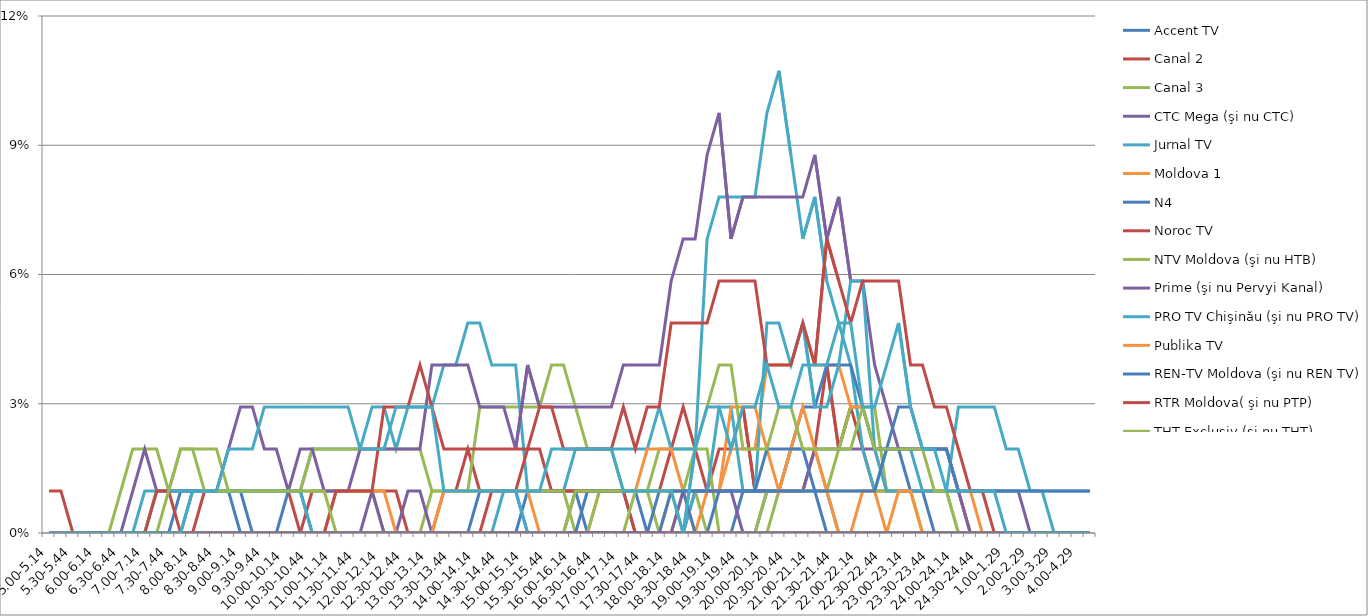
| Category | Accent TV | Canal 2 | Canal 3 | CTC Mega (şi nu CTC) | Jurnal TV | Moldova 1 | N4 | Noroc TV | NTV Moldova (şi nu HTB) | Prime (şi nu Pervyi Kanal) | PRO TV Chişinău (şi nu PRO TV) | Publika TV  | REN-TV Moldova (şi nu REN TV)  | RTR Moldova( şi nu PTP)  | THT Exclusiv (şi nu THT) | TV8 | TVC 21 | TVR MOLDOVA (şi nu TVR) | Canal Regional | Familia Domashniy | ITV | Moldova 2 | Alt canal |
|---|---|---|---|---|---|---|---|---|---|---|---|---|---|---|---|---|---|---|---|---|---|---|---|
| 5.00-5.14 | 0 | 0 | 0 | 0 | 0 | 0 | 0 | 0 | 0 | 0 | 0 | 0 | 0 | 0.01 | 0 | 0 | 0 | 0 | 0 | 0 | 0 | 0 | 0 |
| 5.15-5.29 | 0 | 0 | 0 | 0 | 0 | 0 | 0 | 0 | 0 | 0 | 0 | 0 | 0 | 0.01 | 0 | 0 | 0 | 0 | 0 | 0 | 0 | 0 | 0 |
| 5.30-5.44 | 0 | 0 | 0 | 0 | 0 | 0 | 0 | 0 | 0 | 0 | 0 | 0 | 0 | 0 | 0 | 0 | 0 | 0 | 0 | 0 | 0 | 0 | 0 |
| 5.45-5.59 | 0 | 0 | 0 | 0 | 0 | 0 | 0 | 0 | 0 | 0 | 0 | 0 | 0 | 0 | 0 | 0 | 0 | 0 | 0 | 0 | 0 | 0 | 0 |
| 6.00-6.14 | 0 | 0 | 0 | 0 | 0 | 0 | 0 | 0 | 0 | 0 | 0 | 0 | 0 | 0 | 0 | 0 | 0 | 0 | 0 | 0 | 0 | 0 | 0 |
| 6.15-6.29 | 0 | 0 | 0 | 0 | 0 | 0 | 0 | 0 | 0 | 0 | 0 | 0 | 0 | 0 | 0 | 0 | 0 | 0 | 0 | 0 | 0 | 0 | 0 |
| 6.30-6.44 | 0 | 0 | 0.01 | 0 | 0 | 0 | 0 | 0 | 0 | 0 | 0 | 0 | 0 | 0 | 0 | 0 | 0 | 0 | 0 | 0 | 0 | 0 | 0 |
| 6.45-6.59 | 0 | 0 | 0.02 | 0 | 0 | 0 | 0 | 0 | 0 | 0.01 | 0 | 0 | 0 | 0 | 0 | 0 | 0 | 0 | 0 | 0 | 0 | 0 | 0 |
| 7.00-7.14 | 0 | 0 | 0.02 | 0 | 0 | 0 | 0 | 0 | 0 | 0.02 | 0.01 | 0 | 0 | 0 | 0 | 0 | 0 | 0 | 0 | 0 | 0 | 0 | 0 |
| 7.15-7.29 | 0 | 0 | 0.02 | 0 | 0.01 | 0 | 0 | 0 | 0.01 | 0.01 | 0.01 | 0 | 0 | 0.01 | 0 | 0 | 0 | 0 | 0 | 0 | 0 | 0 | 0 |
| 7.30-7.44 | 0 | 0 | 0.01 | 0 | 0.01 | 0 | 0 | 0 | 0.01 | 0.01 | 0.01 | 0 | 0 | 0.01 | 0.01 | 0 | 0 | 0 | 0 | 0 | 0 | 0 | 0 |
| 7.45-7.59 | 0 | 0 | 0.01 | 0 | 0.01 | 0 | 0.01 | 0 | 0.02 | 0.01 | 0.01 | 0 | 0 | 0 | 0.02 | 0 | 0 | 0 | 0 | 0 | 0 | 0 | 0 |
| 8.00-8.14 | 0.01 | 0 | 0.01 | 0 | 0.01 | 0 | 0.01 | 0 | 0.02 | 0.01 | 0.01 | 0 | 0 | 0 | 0.02 | 0 | 0 | 0 | 0 | 0 | 0 | 0 | 0.01 |
| 8.15-8.29 | 0.01 | 0.01 | 0.01 | 0 | 0.01 | 0 | 0.01 | 0 | 0.02 | 0.01 | 0.01 | 0 | 0 | 0 | 0.01 | 0 | 0 | 0 | 0 | 0 | 0 | 0 | 0.01 |
| 8.30-8.44 | 0.01 | 0.01 | 0.01 | 0 | 0.01 | 0 | 0.01 | 0 | 0.02 | 0.01 | 0.01 | 0 | 0 | 0 | 0.01 | 0 | 0 | 0 | 0 | 0 | 0 | 0 | 0.01 |
| 8.45-8.59 | 0.01 | 0.01 | 0.01 | 0 | 0.01 | 0 | 0.01 | 0 | 0.01 | 0.02 | 0.01 | 0 | 0 | 0 | 0.01 | 0 | 0 | 0 | 0 | 0 | 0 | 0 | 0.02 |
| 9.00-9.14 | 0 | 0.01 | 0.01 | 0 | 0.01 | 0 | 0.01 | 0 | 0.01 | 0.029 | 0.01 | 0 | 0 | 0 | 0.01 | 0 | 0 | 0 | 0 | 0 | 0 | 0 | 0.02 |
| 9.15-9.29 | 0 | 0.01 | 0.01 | 0 | 0.01 | 0 | 0 | 0 | 0.01 | 0.029 | 0.01 | 0 | 0 | 0 | 0.01 | 0 | 0 | 0 | 0 | 0 | 0 | 0 | 0.02 |
| 9.30-9.44 | 0 | 0.01 | 0.01 | 0 | 0.01 | 0 | 0 | 0 | 0.01 | 0.02 | 0.01 | 0 | 0 | 0 | 0.01 | 0 | 0 | 0 | 0 | 0 | 0 | 0 | 0.029 |
| 9.45-9.59 | 0 | 0.01 | 0.01 | 0 | 0.01 | 0 | 0 | 0 | 0.01 | 0.02 | 0.01 | 0 | 0 | 0 | 0.01 | 0 | 0 | 0 | 0 | 0 | 0 | 0 | 0.029 |
| 10.00-10.14 | 0 | 0.01 | 0.01 | 0 | 0.01 | 0 | 0.01 | 0 | 0.01 | 0.01 | 0.01 | 0 | 0 | 0 | 0.01 | 0 | 0 | 0 | 0 | 0 | 0 | 0 | 0.029 |
| 10.15-10.29 | 0 | 0 | 0.01 | 0 | 0.01 | 0 | 0.01 | 0 | 0.01 | 0.02 | 0.01 | 0 | 0 | 0 | 0.01 | 0 | 0 | 0 | 0 | 0 | 0 | 0 | 0.029 |
| 10.30-10.44 | 0 | 0.01 | 0.01 | 0 | 0.02 | 0 | 0 | 0 | 0.02 | 0.02 | 0 | 0 | 0 | 0 | 0.01 | 0 | 0 | 0 | 0 | 0 | 0 | 0 | 0.029 |
| 10.45-10.59 | 0 | 0.01 | 0.01 | 0 | 0.02 | 0 | 0 | 0 | 0.02 | 0.01 | 0 | 0 | 0 | 0 | 0.01 | 0 | 0 | 0 | 0 | 0 | 0 | 0 | 0.029 |
| 11.00-11.14 | 0 | 0.01 | 0.01 | 0 | 0.02 | 0.01 | 0 | 0 | 0.02 | 0.01 | 0 | 0 | 0 | 0.01 | 0 | 0 | 0 | 0 | 0 | 0 | 0 | 0 | 0.029 |
| 11.15-11.29 | 0 | 0.01 | 0.01 | 0 | 0.02 | 0.01 | 0 | 0 | 0.02 | 0.01 | 0 | 0 | 0 | 0.01 | 0 | 0 | 0 | 0 | 0 | 0 | 0 | 0 | 0.029 |
| 11.30-11.44 | 0 | 0.01 | 0.01 | 0 | 0.02 | 0.01 | 0 | 0 | 0.02 | 0.02 | 0 | 0 | 0 | 0.01 | 0 | 0 | 0 | 0 | 0 | 0 | 0 | 0 | 0.02 |
| 11.45-11.59 | 0 | 0.01 | 0.01 | 0.01 | 0.029 | 0.01 | 0 | 0 | 0.02 | 0.02 | 0 | 0 | 0 | 0.01 | 0 | 0 | 0 | 0 | 0 | 0 | 0 | 0 | 0.02 |
| 12.00-12.14 | 0 | 0.01 | 0 | 0 | 0.029 | 0.01 | 0 | 0 | 0.02 | 0.02 | 0 | 0 | 0 | 0.029 | 0 | 0 | 0 | 0 | 0 | 0 | 0 | 0 | 0.02 |
| 12.15-12.29 | 0 | 0.01 | 0 | 0 | 0.02 | 0 | 0 | 0 | 0.02 | 0.02 | 0 | 0 | 0 | 0.029 | 0 | 0 | 0 | 0 | 0 | 0 | 0 | 0 | 0.029 |
| 12.30-12.44 | 0 | 0 | 0 | 0.01 | 0.029 | 0 | 0 | 0 | 0.02 | 0.02 | 0 | 0 | 0 | 0.029 | 0 | 0 | 0 | 0 | 0 | 0 | 0 | 0 | 0.029 |
| 12.45-12.59 | 0 | 0 | 0 | 0.01 | 0.029 | 0 | 0 | 0 | 0.02 | 0.02 | 0 | 0 | 0 | 0.039 | 0 | 0 | 0 | 0 | 0 | 0 | 0 | 0 | 0.029 |
| 13.00-13.14 | 0 | 0 | 0.01 | 0 | 0.029 | 0 | 0 | 0 | 0.01 | 0.039 | 0 | 0 | 0 | 0.029 | 0 | 0 | 0 | 0 | 0 | 0 | 0 | 0 | 0.029 |
| 13.15-13.29 | 0 | 0.01 | 0.01 | 0 | 0.039 | 0.01 | 0 | 0 | 0.01 | 0.039 | 0 | 0 | 0 | 0.02 | 0 | 0 | 0 | 0 | 0 | 0 | 0 | 0 | 0.01 |
| 13.30-13.44 | 0 | 0.01 | 0.01 | 0 | 0.039 | 0.01 | 0 | 0 | 0.01 | 0.039 | 0 | 0 | 0 | 0.02 | 0 | 0 | 0 | 0 | 0 | 0 | 0 | 0 | 0.01 |
| 13.45-13.59 | 0 | 0.02 | 0.01 | 0 | 0.049 | 0.01 | 0 | 0 | 0.01 | 0.039 | 0 | 0 | 0 | 0.02 | 0 | 0 | 0 | 0 | 0 | 0 | 0 | 0 | 0.01 |
| 14.00-14.14 | 0 | 0.01 | 0.029 | 0 | 0.049 | 0.01 | 0.01 | 0 | 0.01 | 0.029 | 0 | 0 | 0 | 0.02 | 0 | 0 | 0 | 0 | 0 | 0 | 0 | 0 | 0.01 |
| 14.15-14.29 | 0 | 0.01 | 0.029 | 0 | 0.039 | 0.01 | 0.01 | 0.01 | 0.01 | 0.029 | 0 | 0 | 0 | 0.02 | 0 | 0 | 0 | 0 | 0 | 0 | 0 | 0 | 0.01 |
| 14.30-14.44 | 0 | 0.01 | 0.029 | 0 | 0.039 | 0.01 | 0.01 | 0.01 | 0.01 | 0.029 | 0.01 | 0 | 0 | 0.02 | 0 | 0 | 0 | 0 | 0 | 0 | 0 | 0 | 0.01 |
| 14.45-14.59 | 0 | 0.01 | 0.029 | 0 | 0.039 | 0.01 | 0.01 | 0.01 | 0.01 | 0.02 | 0.01 | 0 | 0 | 0.02 | 0 | 0 | 0 | 0 | 0 | 0 | 0 | 0 | 0.01 |
| 15.00-15.14 | 0.01 | 0.01 | 0.029 | 0 | 0.01 | 0.01 | 0 | 0.02 | 0.01 | 0.039 | 0 | 0 | 0 | 0.02 | 0 | 0 | 0 | 0 | 0 | 0 | 0 | 0 | 0.01 |
| 15.15-15.29 | 0.01 | 0.01 | 0.029 | 0 | 0.01 | 0 | 0 | 0.02 | 0.01 | 0.029 | 0 | 0 | 0 | 0.029 | 0 | 0 | 0 | 0 | 0 | 0 | 0 | 0 | 0.01 |
| 15.30-15.44 | 0.01 | 0.01 | 0.039 | 0 | 0.01 | 0 | 0 | 0.01 | 0.01 | 0.029 | 0 | 0 | 0 | 0.029 | 0 | 0 | 0 | 0 | 0 | 0 | 0 | 0 | 0.02 |
| 15.45-15.59 | 0.01 | 0.01 | 0.039 | 0 | 0.01 | 0 | 0 | 0.01 | 0.01 | 0.029 | 0 | 0 | 0 | 0.02 | 0 | 0 | 0 | 0 | 0 | 0 | 0 | 0 | 0.02 |
| 16.00-16.14 | 0.01 | 0.01 | 0.029 | 0 | 0.02 | 0 | 0.01 | 0.01 | 0 | 0.029 | 0 | 0 | 0 | 0.02 | 0 | 0 | 0 | 0 | 0 | 0 | 0.01 | 0 | 0.02 |
| 16.15-16.29 | 0 | 0.01 | 0.02 | 0 | 0.02 | 0 | 0.01 | 0.01 | 0 | 0.029 | 0 | 0 | 0.01 | 0.02 | 0 | 0 | 0 | 0 | 0 | 0 | 0.01 | 0 | 0.02 |
| 16.30-16.44 | 0 | 0.01 | 0.02 | 0 | 0.02 | 0.01 | 0.01 | 0.01 | 0.01 | 0.029 | 0 | 0 | 0.01 | 0.02 | 0 | 0 | 0 | 0 | 0 | 0 | 0.01 | 0 | 0.02 |
| 16.45-16.59 | 0 | 0.01 | 0.02 | 0 | 0.02 | 0.01 | 0.01 | 0.01 | 0.01 | 0.029 | 0 | 0 | 0.01 | 0.02 | 0 | 0 | 0 | 0 | 0 | 0 | 0.01 | 0 | 0.02 |
| 17.00-17.14 | 0 | 0.01 | 0.01 | 0 | 0.02 | 0.01 | 0.01 | 0.01 | 0.01 | 0.039 | 0 | 0 | 0.01 | 0.029 | 0 | 0 | 0 | 0 | 0 | 0 | 0.01 | 0 | 0.01 |
| 17.15-17.29 | 0 | 0.01 | 0.01 | 0 | 0.02 | 0.01 | 0 | 0 | 0.01 | 0.039 | 0 | 0 | 0.01 | 0.02 | 0.01 | 0 | 0 | 0 | 0 | 0 | 0.01 | 0 | 0.01 |
| 17.30-17.44 | 0 | 0.01 | 0.01 | 0 | 0.02 | 0.02 | 0 | 0 | 0.01 | 0.039 | 0 | 0 | 0 | 0.029 | 0.01 | 0 | 0 | 0 | 0 | 0 | 0.01 | 0 | 0.01 |
| 17.45-17.59 | 0 | 0.01 | 0.02 | 0 | 0.029 | 0.02 | 0 | 0 | 0 | 0.039 | 0 | 0 | 0.01 | 0.029 | 0.01 | 0 | 0 | 0 | 0 | 0 | 0.01 | 0 | 0.01 |
| 18.00-18.14 | 0 | 0.02 | 0.02 | 0 | 0.02 | 0.02 | 0 | 0 | 0 | 0.059 | 0 | 0.01 | 0.01 | 0.049 | 0.01 | 0 | 0 | 0 | 0.01 | 0 | 0.01 | 0 | 0.01 |
| 18.15-18.29 | 0 | 0.029 | 0.02 | 0 | 0.02 | 0.01 | 0 | 0 | 0.01 | 0.068 | 0 | 0.01 | 0.01 | 0.049 | 0.01 | 0.01 | 0 | 0 | 0.01 | 0 | 0 | 0 | 0 |
| 18.30-18.44 | 0 | 0.02 | 0.02 | 0.01 | 0.02 | 0.01 | 0 | 0 | 0.01 | 0.068 | 0.01 | 0 | 0 | 0.049 | 0.02 | 0.01 | 0 | 0 | 0.01 | 0 | 0 | 0 | 0.02 |
| 18.45-18.59 | 0 | 0.01 | 0.02 | 0.01 | 0.068 | 0.01 | 0 | 0 | 0 | 0.088 | 0.01 | 0.01 | 0 | 0.049 | 0.029 | 0.01 | 0 | 0 | 0.01 | 0 | 0 | 0 | 0.029 |
| 19.00-19.14 | 0 | 0.02 | 0 | 0.01 | 0.078 | 0.01 | 0 | 0 | 0 | 0.098 | 0.029 | 0.01 | 0.01 | 0.059 | 0.039 | 0.01 | 0 | 0 | 0.01 | 0 | 0 | 0 | 0.029 |
| 19.15-19.29 | 0 | 0.02 | 0 | 0.01 | 0.078 | 0.02 | 0 | 0 | 0 | 0.068 | 0.029 | 0.029 | 0.01 | 0.059 | 0.039 | 0.01 | 0 | 0 | 0.01 | 0 | 0 | 0 | 0.02 |
| 19.30-19.44 | 0.01 | 0.029 | 0 | 0.01 | 0.078 | 0.02 | 0 | 0 | 0 | 0.078 | 0.01 | 0.029 | 0.01 | 0.059 | 0.02 | 0 | 0 | 0 | 0.01 | 0 | 0 | 0 | 0.029 |
| 19.45-19.59 | 0.01 | 0.01 | 0 | 0.01 | 0.078 | 0.02 | 0 | 0 | 0 | 0.078 | 0.01 | 0.029 | 0.01 | 0.059 | 0.02 | 0 | 0 | 0 | 0.01 | 0 | 0 | 0 | 0.029 |
| 20.00-20.14 | 0.01 | 0.01 | 0 | 0.01 | 0.098 | 0.039 | 0.01 | 0 | 0.01 | 0.078 | 0.049 | 0.02 | 0.02 | 0.039 | 0.02 | 0 | 0 | 0 | 0.01 | 0 | 0 | 0 | 0.039 |
| 20.15-20.29 | 0.01 | 0.01 | 0.01 | 0.01 | 0.107 | 0.039 | 0.01 | 0 | 0.01 | 0.078 | 0.049 | 0.01 | 0.02 | 0.039 | 0.029 | 0 | 0 | 0 | 0.01 | 0 | 0 | 0 | 0.029 |
| 20.30-20.44 | 0.01 | 0.01 | 0.02 | 0.01 | 0.088 | 0.039 | 0.02 | 0 | 0.01 | 0.078 | 0.039 | 0.02 | 0.02 | 0.039 | 0.029 | 0 | 0 | 0 | 0.01 | 0 | 0 | 0 | 0.029 |
| 20.45-20.59 | 0.01 | 0.01 | 0.02 | 0.01 | 0.068 | 0.049 | 0.029 | 0 | 0.01 | 0.078 | 0.049 | 0.029 | 0.02 | 0.049 | 0.02 | 0 | 0 | 0 | 0.01 | 0 | 0 | 0 | 0.039 |
| 21.00-21.14 | 0.01 | 0.02 | 0.02 | 0.02 | 0.078 | 0.039 | 0.029 | 0 | 0.01 | 0.088 | 0.029 | 0.02 | 0.01 | 0.039 | 0.02 | 0 | 0 | 0 | 0.01 | 0 | 0 | 0 | 0.039 |
| 21.15-21.29 | 0.01 | 0.039 | 0.01 | 0.02 | 0.059 | 0.039 | 0.039 | 0 | 0.01 | 0.068 | 0.029 | 0.01 | 0.01 | 0.068 | 0.02 | 0 | 0 | 0 | 0 | 0 | 0 | 0 | 0.039 |
| 21.30-21.44 | 0 | 0.02 | 0.02 | 0.02 | 0.049 | 0.039 | 0.039 | 0 | 0.01 | 0.078 | 0.039 | 0 | 0.01 | 0.059 | 0.02 | 0 | 0 | 0 | 0 | 0 | 0 | 0 | 0.049 |
| 21.45-21.59 | 0 | 0.029 | 0.029 | 0.02 | 0.039 | 0.029 | 0.039 | 0 | 0.01 | 0.059 | 0.059 | 0 | 0.01 | 0.049 | 0.02 | 0 | 0 | 0 | 0 | 0 | 0 | 0 | 0.049 |
| 22.00-22.14 | 0 | 0.02 | 0.029 | 0.02 | 0.02 | 0.029 | 0.029 | 0 | 0.01 | 0.059 | 0.059 | 0.01 | 0.01 | 0.059 | 0.029 | 0 | 0 | 0 | 0 | 0 | 0 | 0 | 0.029 |
| 22.15-22.29 | 0 | 0.01 | 0.029 | 0.02 | 0.01 | 0.02 | 0.02 | 0 | 0.01 | 0.039 | 0.02 | 0.01 | 0.01 | 0.059 | 0.02 | 0 | 0 | 0 | 0 | 0 | 0 | 0 | 0.029 |
| 22.30-22.44 | 0 | 0.01 | 0.01 | 0.02 | 0.02 | 0.01 | 0.02 | 0 | 0.01 | 0.029 | 0.01 | 0 | 0.02 | 0.059 | 0.02 | 0 | 0 | 0 | 0 | 0 | 0 | 0 | 0.039 |
| 22.45-22.59 | 0 | 0.01 | 0.01 | 0.02 | 0.02 | 0.01 | 0.02 | 0 | 0.01 | 0.02 | 0.01 | 0.01 | 0.029 | 0.059 | 0.02 | 0 | 0 | 0 | 0 | 0 | 0 | 0 | 0.049 |
| 23.00-23.14 | 0 | 0.01 | 0.01 | 0.02 | 0.02 | 0.01 | 0.01 | 0 | 0.01 | 0.02 | 0.01 | 0.01 | 0.029 | 0.039 | 0.02 | 0 | 0 | 0 | 0 | 0 | 0 | 0 | 0.029 |
| 23.15-23.29 | 0 | 0.01 | 0.01 | 0.02 | 0.01 | 0.01 | 0.01 | 0 | 0 | 0.02 | 0.01 | 0 | 0.02 | 0.039 | 0.02 | 0 | 0 | 0 | 0 | 0 | 0 | 0 | 0.02 |
| 23.30-23.44 | 0 | 0.01 | 0.01 | 0.02 | 0.01 | 0.01 | 0 | 0 | 0 | 0.02 | 0.01 | 0 | 0.02 | 0.029 | 0.01 | 0 | 0 | 0 | 0 | 0 | 0 | 0 | 0.02 |
| 23.45-23.59 | 0 | 0.01 | 0.01 | 0.02 | 0.01 | 0.01 | 0 | 0 | 0 | 0.02 | 0.01 | 0 | 0.02 | 0.029 | 0.01 | 0 | 0 | 0 | 0 | 0 | 0 | 0 | 0.01 |
| 24.00-24.14 | 0 | 0.01 | 0 | 0.01 | 0.01 | 0.01 | 0 | 0 | 0 | 0.01 | 0.029 | 0 | 0.01 | 0.02 | 0 | 0 | 0 | 0 | 0 | 0 | 0 | 0 | 0.01 |
| 24.15-24.29 | 0 | 0 | 0 | 0.01 | 0.01 | 0.01 | 0 | 0 | 0 | 0 | 0.029 | 0 | 0.01 | 0.01 | 0 | 0 | 0 | 0 | 0 | 0 | 0 | 0 | 0.01 |
| 24.30-24.44 | 0 | 0 | 0 | 0.01 | 0.01 | 0 | 0 | 0 | 0 | 0 | 0.029 | 0 | 0.01 | 0.01 | 0 | 0 | 0 | 0 | 0 | 0 | 0 | 0 | 0.01 |
| 24.45-24.59 | 0 | 0 | 0 | 0.01 | 0.01 | 0 | 0 | 0 | 0 | 0 | 0.029 | 0 | 0.01 | 0 | 0 | 0 | 0 | 0 | 0 | 0 | 0 | 0 | 0.01 |
| 1.00-1.29 | 0 | 0 | 0 | 0.01 | 0.01 | 0 | 0 | 0 | 0 | 0 | 0.02 | 0 | 0.01 | 0 | 0 | 0 | 0 | 0 | 0 | 0 | 0 | 0 | 0 |
| 1.30-1. 59 | 0 | 0 | 0 | 0.01 | 0.01 | 0 | 0 | 0 | 0 | 0 | 0.02 | 0 | 0.01 | 0 | 0 | 0 | 0 | 0 | 0 | 0 | 0 | 0 | 0 |
| 2.00-2.29 | 0 | 0 | 0 | 0 | 0.01 | 0 | 0 | 0 | 0 | 0 | 0.01 | 0 | 0.01 | 0 | 0 | 0 | 0 | 0 | 0 | 0 | 0 | 0 | 0 |
| 2.30-2.59 | 0 | 0 | 0 | 0 | 0.01 | 0 | 0 | 0 | 0 | 0 | 0.01 | 0 | 0.01 | 0 | 0 | 0 | 0 | 0 | 0 | 0 | 0 | 0 | 0 |
| 3.00-3.29 | 0 | 0 | 0 | 0 | 0 | 0 | 0 | 0 | 0 | 0 | 0.01 | 0 | 0.01 | 0 | 0 | 0 | 0 | 0 | 0 | 0 | 0 | 0 | 0 |
| 3.30-3.59 | 0 | 0 | 0 | 0 | 0 | 0 | 0 | 0 | 0 | 0 | 0.01 | 0 | 0.01 | 0 | 0 | 0 | 0 | 0 | 0 | 0 | 0 | 0 | 0 |
| 4.00-4.29 | 0 | 0 | 0 | 0 | 0 | 0 | 0 | 0 | 0 | 0 | 0.01 | 0 | 0.01 | 0 | 0 | 0 | 0 | 0 | 0 | 0 | 0 | 0 | 0 |
| 4.30-4.59 | 0 | 0 | 0 | 0 | 0 | 0 | 0 | 0 | 0 | 0 | 0.01 | 0 | 0.01 | 0 | 0 | 0 | 0 | 0 | 0 | 0 | 0 | 0 | 0 |